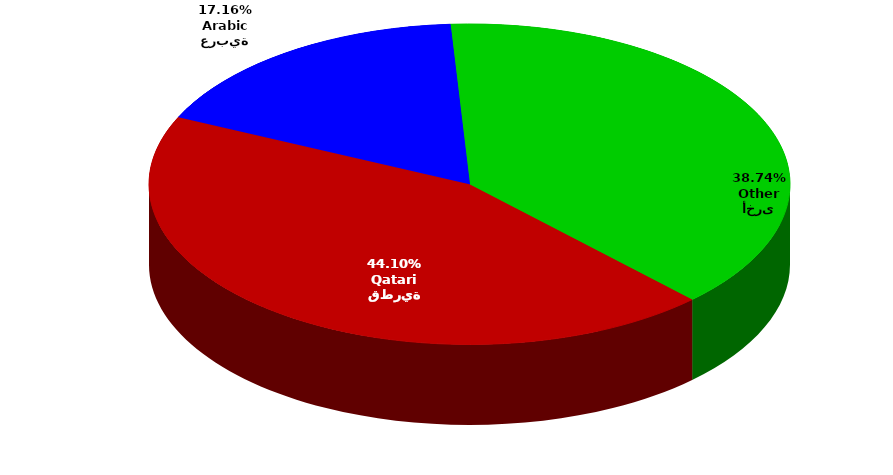
| Category | Series 0 |
|---|---|
| قطرية
Qatari | 188172 |
| عربية
Arabic | 73226 |
| أخرى
Other | 165304 |